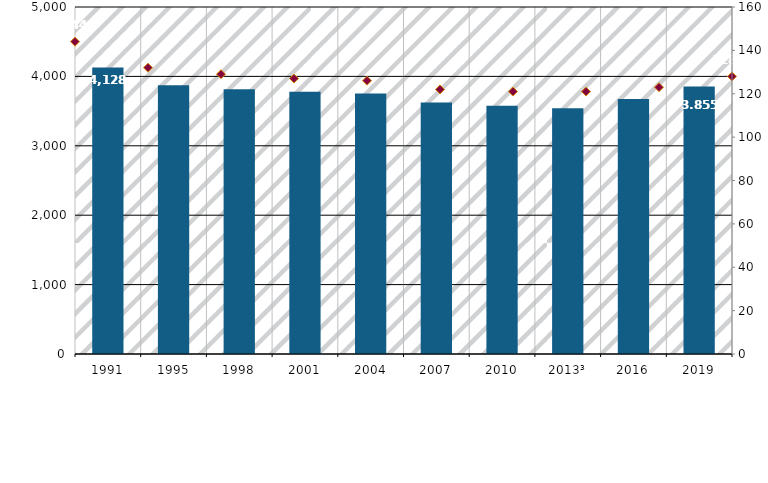
| Category | Millionen Kubikmeter |
|---|---|
| 1991 | 4127.8 |
| 1995 | 3872 |
| 1998 | 3814 |
| 2001 | 3779.1 |
| 2004 | 3752.3 |
| 2007 | 3622.9 |
| 2010 | 3576.9 |
| 2013³ | 3540.5 |
| 2016 | 3675.5 |
| 2019 | 3855 |